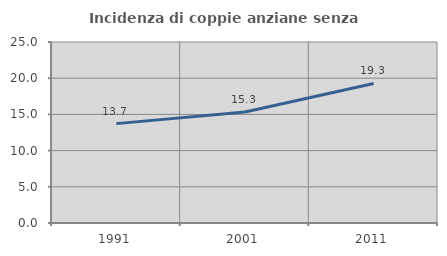
| Category | Incidenza di coppie anziane senza figli  |
|---|---|
| 1991.0 | 13.727 |
| 2001.0 | 15.343 |
| 2011.0 | 19.277 |